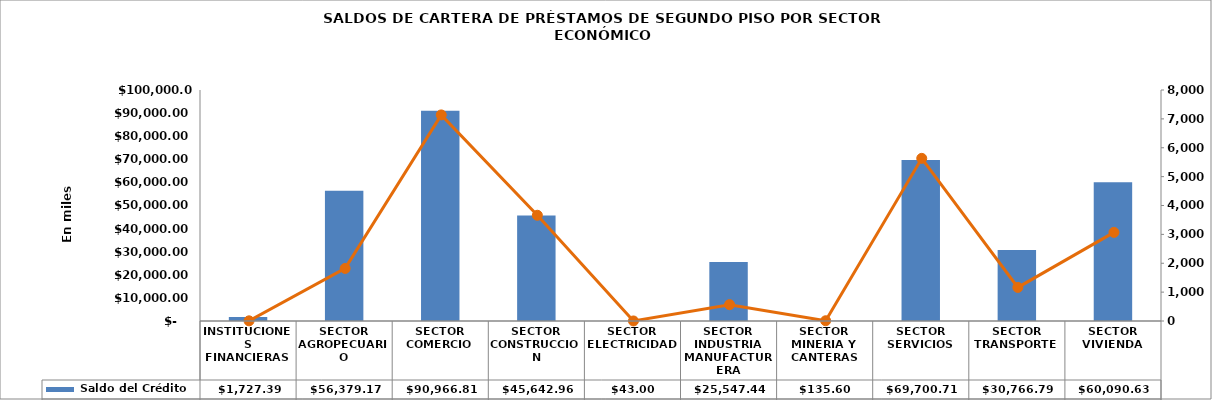
| Category |  Saldo del Crédito |
|---|---|
| INSTITUCIONES FINANCIERAS | 1727.39 |
| SECTOR AGROPECUARIO | 56379.175 |
| SECTOR COMERCIO | 90966.809 |
| SECTOR CONSTRUCCION | 45642.955 |
| SECTOR ELECTRICIDAD | 43.004 |
| SECTOR INDUSTRIA MANUFACTURERA | 25547.442 |
| SECTOR MINERIA Y CANTERAS | 135.605 |
| SECTOR SERVICIOS | 69700.71 |
| SECTOR TRANSPORTE | 30766.787 |
| SECTOR VIVIENDA | 60090.628 |